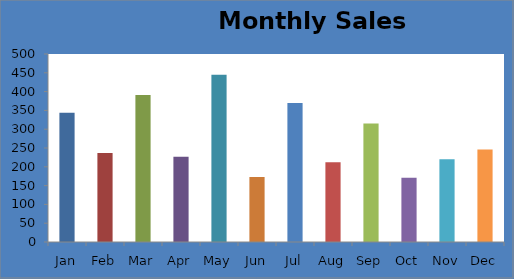
| Category | Sales (in thousands) |
|---|---|
| Jan | 344 |
| Feb | 237 |
| Mar | 391 |
| Apr | 227 |
| May | 445 |
| Jun | 173 |
| Jul | 370 |
| Aug | 212 |
| Sep | 315 |
| Oct | 171 |
| Nov | 220 |
| Dec | 246 |